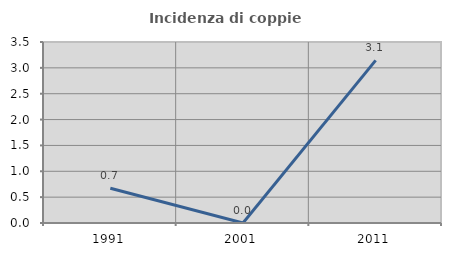
| Category | Incidenza di coppie miste |
|---|---|
| 1991.0 | 0.671 |
| 2001.0 | 0 |
| 2011.0 | 3.145 |